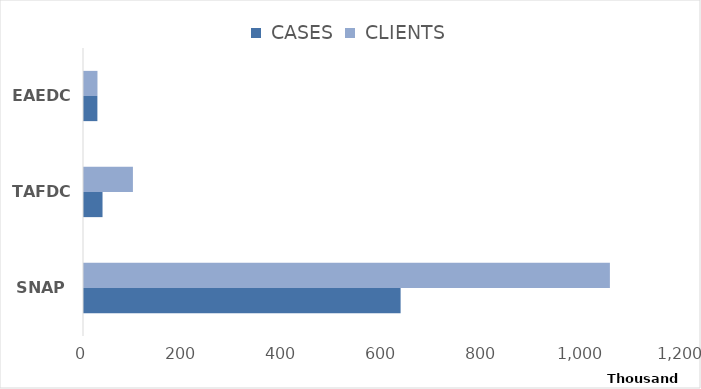
| Category |  CASES |  CLIENTS |
|---|---|---|
| SNAP | 633213 | 1051787 |
| TAFDC | 37049 | 97842 |
| EAEDC | 26780 | 26933 |